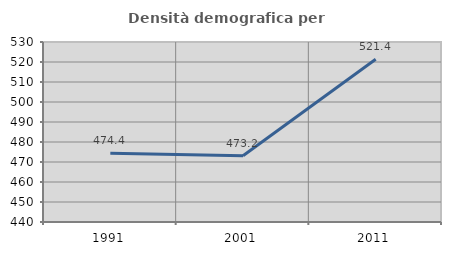
| Category | Densità demografica |
|---|---|
| 1991.0 | 474.41 |
| 2001.0 | 473.155 |
| 2011.0 | 521.394 |